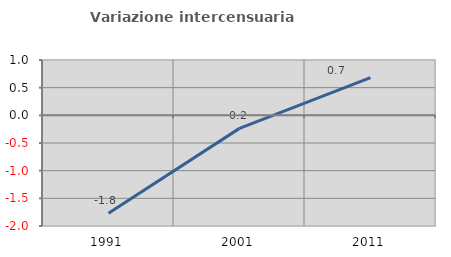
| Category | Variazione intercensuaria annua |
|---|---|
| 1991.0 | -1.768 |
| 2001.0 | -0.236 |
| 2011.0 | 0.68 |